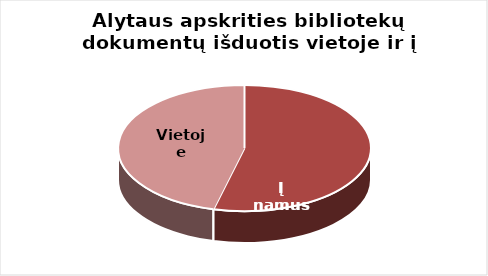
| Category | Series 0 |
|---|---|
| Į namus | 665487 |
| Vietoje | 568355 |